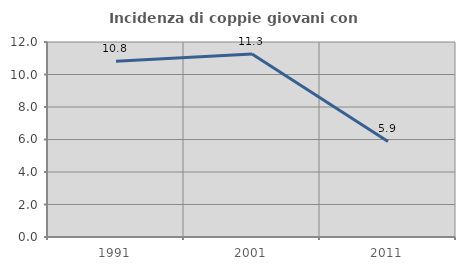
| Category | Incidenza di coppie giovani con figli |
|---|---|
| 1991.0 | 10.811 |
| 2001.0 | 11.268 |
| 2011.0 | 5.882 |